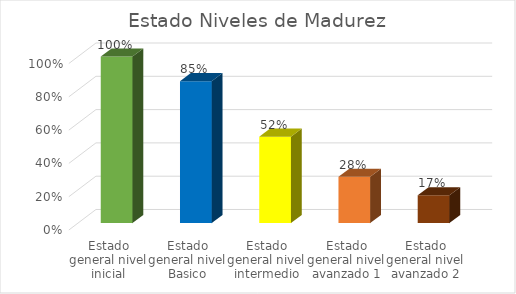
| Category | Elementos clave | Porcentaje |
|---|---|---|
| Estado general nivel inicial |  | 1 |
| Estado general nivel Basico |  | 0.852 |
| Estado general nivel intermedio |  | 0.519 |
| Estado general nivel avanzado 1 |  | 0.278 |
| Estado general nivel avanzado 2 |  | 0.167 |